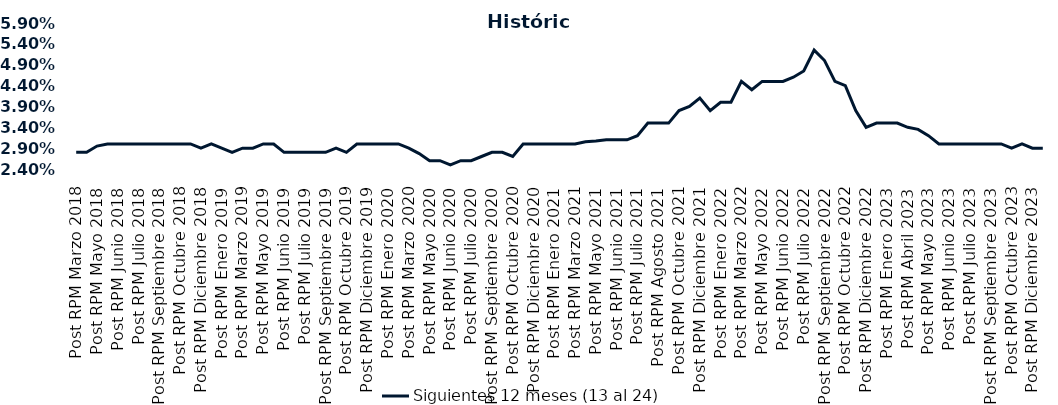
| Category | Siguientes 12 meses (13 al 24)  |
|---|---|
| Post RPM Marzo 2018 | 0.028 |
| Pre RPM Mayo 2018 | 0.028 |
| Post RPM Mayo 2018 | 0.03 |
| Pre RPM Junio 2018 | 0.03 |
| Post RPM Junio 2018 | 0.03 |
| Pre RPM Julio 2018 | 0.03 |
| Post RPM Julio 2018 | 0.03 |
| Pre RPM Septiembre 2018 | 0.03 |
| Post RPM Septiembre 2018 | 0.03 |
| Pre RPM Octubre 2018 | 0.03 |
| Post RPM Octubre 2018 | 0.03 |
| Pre RPM Diciembre 2018 | 0.03 |
| Post RPM Diciembre 2018 | 0.029 |
| Pre RPM Enero 2019 | 0.03 |
| Post RPM Enero 2019 | 0.029 |
| Pre RPM Marzo 2019 | 0.028 |
| Post RPM Marzo 2019 | 0.029 |
| Pre RPM Mayo 2019 | 0.029 |
| Post RPM Mayo 2019 | 0.03 |
| Pre RPM Junio 2019 | 0.03 |
| Post RPM Junio 2019 | 0.028 |
| Pre RPM Julio 2019 | 0.028 |
| Post RPM Julio 2019 | 0.028 |
| Pre RPM Septiembre 2019 | 0.028 |
| Post RPM Septiembre 2019 | 0.028 |
| Pre RPM Octubre 2019 | 0.029 |
| Post RPM Octubre 2019 | 0.028 |
| Pre RPM Diciembre 2019 | 0.03 |
| Post RPM Diciembre 2019 | 0.03 |
| Pre RPM Enero 2020 | 0.03 |
| Post RPM Enero 2020 | 0.03 |
| Pre RPM Marzo 2020 | 0.03 |
| Post RPM Marzo 2020 | 0.029 |
| Pre RPM Mayo 2020 | 0.028 |
| Post RPM Mayo 2020 | 0.026 |
| Pre RPM Junio 2020 | 0.026 |
| Post RPM Junio 2020 | 0.025 |
| Pre RPM Julio 2020 | 0.026 |
| Post RPM Julio 2020 | 0.026 |
| Pre RPM Septiembre 2020 | 0.027 |
| Post RPM Septiembre 2020 | 0.028 |
| Pre RPM Octubre 2020 | 0.028 |
| Post RPM Octubre 2020 | 0.027 |
| Pre RPM Diciembre 2020 | 0.03 |
| Post RPM Diciembre 2020 | 0.03 |
| Pre RPM Enero 2021 | 0.03 |
| Post RPM Enero 2021 | 0.03 |
| Pre RPM Marzo 2021 | 0.03 |
| Post RPM Marzo 2021 | 0.03 |
| Pre RPM Mayo 2021 | 0.031 |
| Post RPM Mayo 2021 | 0.031 |
| Pre RPM Junio 2021 | 0.031 |
| Post RPM Junio 2021 | 0.031 |
| Pre RPM Julio 2021 | 0.031 |
| Post RPM Julio 2021 | 0.032 |
| Pre RPM Agosto 2021 | 0.035 |
| Post RPM Agosto 2021 | 0.035 |
| Pre RPM Octubre 2021 | 0.035 |
| Post RPM Octubre 2021 | 0.038 |
| Pre RPM Diciembre 2021 | 0.039 |
| Post RPM Diciembre 2021 | 0.041 |
| Pre RPM Enero 2022 | 0.038 |
| Post RPM Enero 2022 | 0.04 |
| Pre RPM Marzo 2022 | 0.04 |
| Post RPM Marzo 2022 | 0.045 |
| Pre RPM Mayo 2022 | 0.043 |
| Post RPM Mayo 2022 | 0.045 |
| Pre RPM Junio 2022 | 0.045 |
| Post RPM Junio 2022 | 0.045 |
| Pre RPM Julio 2022 | 0.046 |
| Post RPM Julio 2022 | 0.048 |
| Pre RPM Septiembre 2022 | 0.052 |
| Post RPM Septiembre 2022 | 0.05 |
| Pre RPM Octubre 2022 | 0.045 |
| Post RPM Octubre 2022 | 0.044 |
| Pre RPM Diciembre 2022 | 0.038 |
| Post RPM Diciembre 2022 | 0.034 |
| Pre RPM Enero 2023 | 0.035 |
| Post RPM Enero 2023 | 0.035 |
| Pre RPM Abril 2023 | 0.035 |
| Post RPM Abril 2023 | 0.034 |
| Pre RPM Mayo 2023 | 0.034 |
| Post RPM Mayo 2023 | 0.032 |
| Pre RPM Junio 2023 | 0.03 |
| Post RPM Junio 2023 | 0.03 |
| Pre RPM Julio 2023 | 0.03 |
| Post RPM Julio 2023 | 0.03 |
| Pre RPM Septiembre 2023 | 0.03 |
| Post RPM Septiembre 2023 | 0.03 |
| Pre RPM Octubre 2023 | 0.03 |
| Post RPM Octubre 2023 | 0.029 |
| Pre RPM Diciembre 2023 | 0.03 |
| Post RPM Diciembre 2023 | 0.029 |
| Pre RPM Enero 2024 | 0.029 |